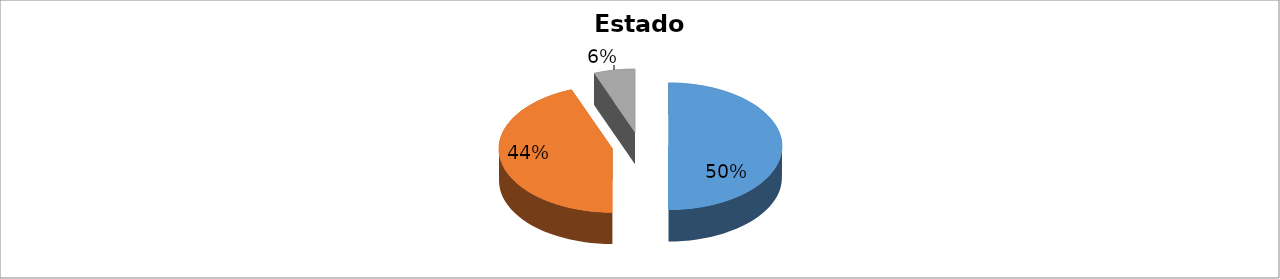
| Category | Series 0 |
|---|---|
| Casado(a)/unión libre | 0.5 |
| Soltero | 0.441 |
| Otro | 0.059 |